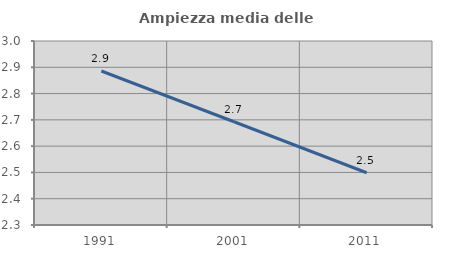
| Category | Ampiezza media delle famiglie |
|---|---|
| 1991.0 | 2.886 |
| 2001.0 | 2.693 |
| 2011.0 | 2.499 |